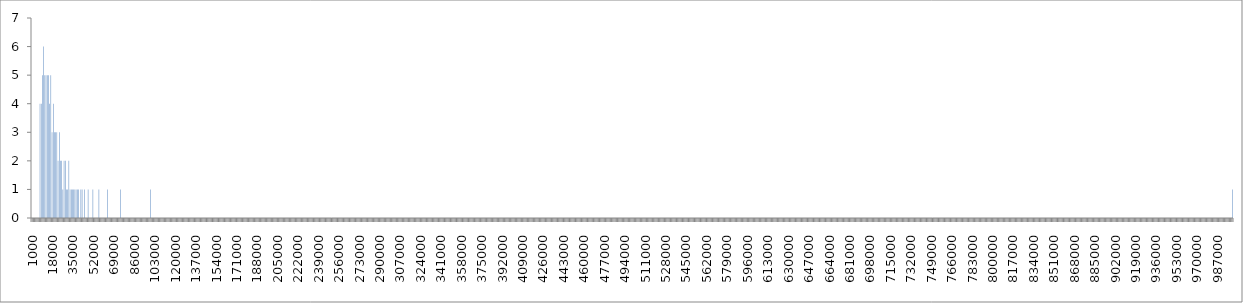
| Category | Series 0 |
|---|---|
| 1000.0 | 0 |
| 2000.0 | 0 |
| 3000.0 | 0 |
| 4000.0 | 0 |
| 5000.0 | 0 |
| 6000.0 | 0 |
| 7000.0 | 0 |
| 8000.0 | 4 |
| 9000.0 | 4 |
| 10000.0 | 5 |
| 11000.0 | 6 |
| 12000.0 | 5 |
| 13000.0 | 5 |
| 14000.0 | 5 |
| 15000.0 | 5 |
| 16000.0 | 4 |
| 17000.0 | 5 |
| 18000.0 | 3 |
| 19000.0 | 4 |
| 20000.0 | 3 |
| 21000.0 | 3 |
| 22000.0 | 3 |
| 23000.0 | 2 |
| 24000.0 | 3 |
| 25000.0 | 2 |
| 26000.0 | 2 |
| 27000.0 | 1 |
| 28000.0 | 2 |
| 29000.0 | 2 |
| 30000.0 | 1 |
| 31000.0 | 1 |
| 32000.0 | 2 |
| 33000.0 | 1 |
| 34000.0 | 1 |
| 35000.0 | 1 |
| 36000.0 | 1 |
| 37000.0 | 1 |
| 38000.0 | 1 |
| 39000.0 | 1 |
| 40000.0 | 1 |
| 41000.0 | 0 |
| 42000.0 | 1 |
| 43000.0 | 1 |
| 44000.0 | 0 |
| 45000.0 | 1 |
| 46000.0 | 0 |
| 47000.0 | 0 |
| 48000.0 | 1 |
| 49000.0 | 0 |
| 50000.0 | 0 |
| 51000.0 | 0 |
| 52000.0 | 1 |
| 53000.0 | 0 |
| 54000.0 | 0 |
| 55000.0 | 0 |
| 56000.0 | 0 |
| 57000.0 | 1 |
| 58000.0 | 0 |
| 59000.0 | 0 |
| 60000.0 | 0 |
| 61000.0 | 0 |
| 62000.0 | 0 |
| 63000.0 | 0 |
| 64000.0 | 1 |
| 65000.0 | 0 |
| 66000.0 | 0 |
| 67000.0 | 0 |
| 68000.0 | 0 |
| 69000.0 | 0 |
| 70000.0 | 0 |
| 71000.0 | 0 |
| 72000.0 | 0 |
| 73000.0 | 0 |
| 74000.0 | 0 |
| 75000.0 | 1 |
| 76000.0 | 0 |
| 77000.0 | 0 |
| 78000.0 | 0 |
| 79000.0 | 0 |
| 80000.0 | 0 |
| 81000.0 | 0 |
| 82000.0 | 0 |
| 83000.0 | 0 |
| 84000.0 | 0 |
| 85000.0 | 0 |
| 86000.0 | 0 |
| 87000.0 | 0 |
| 88000.0 | 0 |
| 89000.0 | 0 |
| 90000.0 | 0 |
| 91000.0 | 0 |
| 92000.0 | 0 |
| 93000.0 | 0 |
| 94000.0 | 0 |
| 95000.0 | 0 |
| 96000.0 | 0 |
| 97000.0 | 0 |
| 98000.0 | 0 |
| 99000.0 | 0 |
| 100000.0 | 1 |
| 101000.0 | 0 |
| 102000.0 | 0 |
| 103000.0 | 0 |
| 104000.0 | 0 |
| 105000.0 | 0 |
| 106000.0 | 0 |
| 107000.0 | 0 |
| 108000.0 | 0 |
| 109000.0 | 0 |
| 110000.0 | 0 |
| 111000.0 | 0 |
| 112000.0 | 0 |
| 113000.0 | 0 |
| 114000.0 | 0 |
| 115000.0 | 0 |
| 116000.0 | 0 |
| 117000.0 | 0 |
| 118000.0 | 0 |
| 119000.0 | 0 |
| 120000.0 | 0 |
| 121000.0 | 0 |
| 122000.0 | 0 |
| 123000.0 | 0 |
| 124000.0 | 0 |
| 125000.0 | 0 |
| 126000.0 | 0 |
| 127000.0 | 0 |
| 128000.0 | 0 |
| 129000.0 | 0 |
| 130000.0 | 0 |
| 131000.0 | 0 |
| 132000.0 | 0 |
| 133000.0 | 0 |
| 134000.0 | 0 |
| 135000.0 | 0 |
| 136000.0 | 0 |
| 137000.0 | 0 |
| 138000.0 | 0 |
| 139000.0 | 0 |
| 140000.0 | 0 |
| 141000.0 | 0 |
| 142000.0 | 0 |
| 143000.0 | 0 |
| 144000.0 | 0 |
| 145000.0 | 0 |
| 146000.0 | 0 |
| 147000.0 | 0 |
| 148000.0 | 0 |
| 149000.0 | 0 |
| 150000.0 | 0 |
| 151000.0 | 0 |
| 152000.0 | 0 |
| 153000.0 | 0 |
| 154000.0 | 0 |
| 155000.0 | 0 |
| 156000.0 | 0 |
| 157000.0 | 0 |
| 158000.0 | 0 |
| 159000.0 | 0 |
| 160000.0 | 0 |
| 161000.0 | 0 |
| 162000.0 | 0 |
| 163000.0 | 0 |
| 164000.0 | 0 |
| 165000.0 | 0 |
| 166000.0 | 0 |
| 167000.0 | 0 |
| 168000.0 | 0 |
| 169000.0 | 0 |
| 170000.0 | 0 |
| 171000.0 | 0 |
| 172000.0 | 0 |
| 173000.0 | 0 |
| 174000.0 | 0 |
| 175000.0 | 0 |
| 176000.0 | 0 |
| 177000.0 | 0 |
| 178000.0 | 0 |
| 179000.0 | 0 |
| 180000.0 | 0 |
| 181000.0 | 0 |
| 182000.0 | 0 |
| 183000.0 | 0 |
| 184000.0 | 0 |
| 185000.0 | 0 |
| 186000.0 | 0 |
| 187000.0 | 0 |
| 188000.0 | 0 |
| 189000.0 | 0 |
| 190000.0 | 0 |
| 191000.0 | 0 |
| 192000.0 | 0 |
| 193000.0 | 0 |
| 194000.0 | 0 |
| 195000.0 | 0 |
| 196000.0 | 0 |
| 197000.0 | 0 |
| 198000.0 | 0 |
| 199000.0 | 0 |
| 200000.0 | 0 |
| 201000.0 | 0 |
| 202000.0 | 0 |
| 203000.0 | 0 |
| 204000.0 | 0 |
| 205000.0 | 0 |
| 206000.0 | 0 |
| 207000.0 | 0 |
| 208000.0 | 0 |
| 209000.0 | 0 |
| 210000.0 | 0 |
| 211000.0 | 0 |
| 212000.0 | 0 |
| 213000.0 | 0 |
| 214000.0 | 0 |
| 215000.0 | 0 |
| 216000.0 | 0 |
| 217000.0 | 0 |
| 218000.0 | 0 |
| 219000.0 | 0 |
| 220000.0 | 0 |
| 221000.0 | 0 |
| 222000.0 | 0 |
| 223000.0 | 0 |
| 224000.0 | 0 |
| 225000.0 | 0 |
| 226000.0 | 0 |
| 227000.0 | 0 |
| 228000.0 | 0 |
| 229000.0 | 0 |
| 230000.0 | 0 |
| 231000.0 | 0 |
| 232000.0 | 0 |
| 233000.0 | 0 |
| 234000.0 | 0 |
| 235000.0 | 0 |
| 236000.0 | 0 |
| 237000.0 | 0 |
| 238000.0 | 0 |
| 239000.0 | 0 |
| 240000.0 | 0 |
| 241000.0 | 0 |
| 242000.0 | 0 |
| 243000.0 | 0 |
| 244000.0 | 0 |
| 245000.0 | 0 |
| 246000.0 | 0 |
| 247000.0 | 0 |
| 248000.0 | 0 |
| 249000.0 | 0 |
| 250000.0 | 0 |
| 251000.0 | 0 |
| 252000.0 | 0 |
| 253000.0 | 0 |
| 254000.0 | 0 |
| 255000.0 | 0 |
| 256000.0 | 0 |
| 257000.0 | 0 |
| 258000.0 | 0 |
| 259000.0 | 0 |
| 260000.0 | 0 |
| 261000.0 | 0 |
| 262000.0 | 0 |
| 263000.0 | 0 |
| 264000.0 | 0 |
| 265000.0 | 0 |
| 266000.0 | 0 |
| 267000.0 | 0 |
| 268000.0 | 0 |
| 269000.0 | 0 |
| 270000.0 | 0 |
| 271000.0 | 0 |
| 272000.0 | 0 |
| 273000.0 | 0 |
| 274000.0 | 0 |
| 275000.0 | 0 |
| 276000.0 | 0 |
| 277000.0 | 0 |
| 278000.0 | 0 |
| 279000.0 | 0 |
| 280000.0 | 0 |
| 281000.0 | 0 |
| 282000.0 | 0 |
| 283000.0 | 0 |
| 284000.0 | 0 |
| 285000.0 | 0 |
| 286000.0 | 0 |
| 287000.0 | 0 |
| 288000.0 | 0 |
| 289000.0 | 0 |
| 290000.0 | 0 |
| 291000.0 | 0 |
| 292000.0 | 0 |
| 293000.0 | 0 |
| 294000.0 | 0 |
| 295000.0 | 0 |
| 296000.0 | 0 |
| 297000.0 | 0 |
| 298000.0 | 0 |
| 299000.0 | 0 |
| 300000.0 | 0 |
| 301000.0 | 0 |
| 302000.0 | 0 |
| 303000.0 | 0 |
| 304000.0 | 0 |
| 305000.0 | 0 |
| 306000.0 | 0 |
| 307000.0 | 0 |
| 308000.0 | 0 |
| 309000.0 | 0 |
| 310000.0 | 0 |
| 311000.0 | 0 |
| 312000.0 | 0 |
| 313000.0 | 0 |
| 314000.0 | 0 |
| 315000.0 | 0 |
| 316000.0 | 0 |
| 317000.0 | 0 |
| 318000.0 | 0 |
| 319000.0 | 0 |
| 320000.0 | 0 |
| 321000.0 | 0 |
| 322000.0 | 0 |
| 323000.0 | 0 |
| 324000.0 | 0 |
| 325000.0 | 0 |
| 326000.0 | 0 |
| 327000.0 | 0 |
| 328000.0 | 0 |
| 329000.0 | 0 |
| 330000.0 | 0 |
| 331000.0 | 0 |
| 332000.0 | 0 |
| 333000.0 | 0 |
| 334000.0 | 0 |
| 335000.0 | 0 |
| 336000.0 | 0 |
| 337000.0 | 0 |
| 338000.0 | 0 |
| 339000.0 | 0 |
| 340000.0 | 0 |
| 341000.0 | 0 |
| 342000.0 | 0 |
| 343000.0 | 0 |
| 344000.0 | 0 |
| 345000.0 | 0 |
| 346000.0 | 0 |
| 347000.0 | 0 |
| 348000.0 | 0 |
| 349000.0 | 0 |
| 350000.0 | 0 |
| 351000.0 | 0 |
| 352000.0 | 0 |
| 353000.0 | 0 |
| 354000.0 | 0 |
| 355000.0 | 0 |
| 356000.0 | 0 |
| 357000.0 | 0 |
| 358000.0 | 0 |
| 359000.0 | 0 |
| 360000.0 | 0 |
| 361000.0 | 0 |
| 362000.0 | 0 |
| 363000.0 | 0 |
| 364000.0 | 0 |
| 365000.0 | 0 |
| 366000.0 | 0 |
| 367000.0 | 0 |
| 368000.0 | 0 |
| 369000.0 | 0 |
| 370000.0 | 0 |
| 371000.0 | 0 |
| 372000.0 | 0 |
| 373000.0 | 0 |
| 374000.0 | 0 |
| 375000.0 | 0 |
| 376000.0 | 0 |
| 377000.0 | 0 |
| 378000.0 | 0 |
| 379000.0 | 0 |
| 380000.0 | 0 |
| 381000.0 | 0 |
| 382000.0 | 0 |
| 383000.0 | 0 |
| 384000.0 | 0 |
| 385000.0 | 0 |
| 386000.0 | 0 |
| 387000.0 | 0 |
| 388000.0 | 0 |
| 389000.0 | 0 |
| 390000.0 | 0 |
| 391000.0 | 0 |
| 392000.0 | 0 |
| 393000.0 | 0 |
| 394000.0 | 0 |
| 395000.0 | 0 |
| 396000.0 | 0 |
| 397000.0 | 0 |
| 398000.0 | 0 |
| 399000.0 | 0 |
| 400000.0 | 0 |
| 401000.0 | 0 |
| 402000.0 | 0 |
| 403000.0 | 0 |
| 404000.0 | 0 |
| 405000.0 | 0 |
| 406000.0 | 0 |
| 407000.0 | 0 |
| 408000.0 | 0 |
| 409000.0 | 0 |
| 410000.0 | 0 |
| 411000.0 | 0 |
| 412000.0 | 0 |
| 413000.0 | 0 |
| 414000.0 | 0 |
| 415000.0 | 0 |
| 416000.0 | 0 |
| 417000.0 | 0 |
| 418000.0 | 0 |
| 419000.0 | 0 |
| 420000.0 | 0 |
| 421000.0 | 0 |
| 422000.0 | 0 |
| 423000.0 | 0 |
| 424000.0 | 0 |
| 425000.0 | 0 |
| 426000.0 | 0 |
| 427000.0 | 0 |
| 428000.0 | 0 |
| 429000.0 | 0 |
| 430000.0 | 0 |
| 431000.0 | 0 |
| 432000.0 | 0 |
| 433000.0 | 0 |
| 434000.0 | 0 |
| 435000.0 | 0 |
| 436000.0 | 0 |
| 437000.0 | 0 |
| 438000.0 | 0 |
| 439000.0 | 0 |
| 440000.0 | 0 |
| 441000.0 | 0 |
| 442000.0 | 0 |
| 443000.0 | 0 |
| 444000.0 | 0 |
| 445000.0 | 0 |
| 446000.0 | 0 |
| 447000.0 | 0 |
| 448000.0 | 0 |
| 449000.0 | 0 |
| 450000.0 | 0 |
| 451000.0 | 0 |
| 452000.0 | 0 |
| 453000.0 | 0 |
| 454000.0 | 0 |
| 455000.0 | 0 |
| 456000.0 | 0 |
| 457000.0 | 0 |
| 458000.0 | 0 |
| 459000.0 | 0 |
| 460000.0 | 0 |
| 461000.0 | 0 |
| 462000.0 | 0 |
| 463000.0 | 0 |
| 464000.0 | 0 |
| 465000.0 | 0 |
| 466000.0 | 0 |
| 467000.0 | 0 |
| 468000.0 | 0 |
| 469000.0 | 0 |
| 470000.0 | 0 |
| 471000.0 | 0 |
| 472000.0 | 0 |
| 473000.0 | 0 |
| 474000.0 | 0 |
| 475000.0 | 0 |
| 476000.0 | 0 |
| 477000.0 | 0 |
| 478000.0 | 0 |
| 479000.0 | 0 |
| 480000.0 | 0 |
| 481000.0 | 0 |
| 482000.0 | 0 |
| 483000.0 | 0 |
| 484000.0 | 0 |
| 485000.0 | 0 |
| 486000.0 | 0 |
| 487000.0 | 0 |
| 488000.0 | 0 |
| 489000.0 | 0 |
| 490000.0 | 0 |
| 491000.0 | 0 |
| 492000.0 | 0 |
| 493000.0 | 0 |
| 494000.0 | 0 |
| 495000.0 | 0 |
| 496000.0 | 0 |
| 497000.0 | 0 |
| 498000.0 | 0 |
| 499000.0 | 0 |
| 500000.0 | 0 |
| 501000.0 | 0 |
| 502000.0 | 0 |
| 503000.0 | 0 |
| 504000.0 | 0 |
| 505000.0 | 0 |
| 506000.0 | 0 |
| 507000.0 | 0 |
| 508000.0 | 0 |
| 509000.0 | 0 |
| 510000.0 | 0 |
| 511000.0 | 0 |
| 512000.0 | 0 |
| 513000.0 | 0 |
| 514000.0 | 0 |
| 515000.0 | 0 |
| 516000.0 | 0 |
| 517000.0 | 0 |
| 518000.0 | 0 |
| 519000.0 | 0 |
| 520000.0 | 0 |
| 521000.0 | 0 |
| 522000.0 | 0 |
| 523000.0 | 0 |
| 524000.0 | 0 |
| 525000.0 | 0 |
| 526000.0 | 0 |
| 527000.0 | 0 |
| 528000.0 | 0 |
| 529000.0 | 0 |
| 530000.0 | 0 |
| 531000.0 | 0 |
| 532000.0 | 0 |
| 533000.0 | 0 |
| 534000.0 | 0 |
| 535000.0 | 0 |
| 536000.0 | 0 |
| 537000.0 | 0 |
| 538000.0 | 0 |
| 539000.0 | 0 |
| 540000.0 | 0 |
| 541000.0 | 0 |
| 542000.0 | 0 |
| 543000.0 | 0 |
| 544000.0 | 0 |
| 545000.0 | 0 |
| 546000.0 | 0 |
| 547000.0 | 0 |
| 548000.0 | 0 |
| 549000.0 | 0 |
| 550000.0 | 0 |
| 551000.0 | 0 |
| 552000.0 | 0 |
| 553000.0 | 0 |
| 554000.0 | 0 |
| 555000.0 | 0 |
| 556000.0 | 0 |
| 557000.0 | 0 |
| 558000.0 | 0 |
| 559000.0 | 0 |
| 560000.0 | 0 |
| 561000.0 | 0 |
| 562000.0 | 0 |
| 563000.0 | 0 |
| 564000.0 | 0 |
| 565000.0 | 0 |
| 566000.0 | 0 |
| 567000.0 | 0 |
| 568000.0 | 0 |
| 569000.0 | 0 |
| 570000.0 | 0 |
| 571000.0 | 0 |
| 572000.0 | 0 |
| 573000.0 | 0 |
| 574000.0 | 0 |
| 575000.0 | 0 |
| 576000.0 | 0 |
| 577000.0 | 0 |
| 578000.0 | 0 |
| 579000.0 | 0 |
| 580000.0 | 0 |
| 581000.0 | 0 |
| 582000.0 | 0 |
| 583000.0 | 0 |
| 584000.0 | 0 |
| 585000.0 | 0 |
| 586000.0 | 0 |
| 587000.0 | 0 |
| 588000.0 | 0 |
| 589000.0 | 0 |
| 590000.0 | 0 |
| 591000.0 | 0 |
| 592000.0 | 0 |
| 593000.0 | 0 |
| 594000.0 | 0 |
| 595000.0 | 0 |
| 596000.0 | 0 |
| 597000.0 | 0 |
| 598000.0 | 0 |
| 599000.0 | 0 |
| 600000.0 | 0 |
| 601000.0 | 0 |
| 602000.0 | 0 |
| 603000.0 | 0 |
| 604000.0 | 0 |
| 605000.0 | 0 |
| 606000.0 | 0 |
| 607000.0 | 0 |
| 608000.0 | 0 |
| 609000.0 | 0 |
| 610000.0 | 0 |
| 611000.0 | 0 |
| 612000.0 | 0 |
| 613000.0 | 0 |
| 614000.0 | 0 |
| 615000.0 | 0 |
| 616000.0 | 0 |
| 617000.0 | 0 |
| 618000.0 | 0 |
| 619000.0 | 0 |
| 620000.0 | 0 |
| 621000.0 | 0 |
| 622000.0 | 0 |
| 623000.0 | 0 |
| 624000.0 | 0 |
| 625000.0 | 0 |
| 626000.0 | 0 |
| 627000.0 | 0 |
| 628000.0 | 0 |
| 629000.0 | 0 |
| 630000.0 | 0 |
| 631000.0 | 0 |
| 632000.0 | 0 |
| 633000.0 | 0 |
| 634000.0 | 0 |
| 635000.0 | 0 |
| 636000.0 | 0 |
| 637000.0 | 0 |
| 638000.0 | 0 |
| 639000.0 | 0 |
| 640000.0 | 0 |
| 641000.0 | 0 |
| 642000.0 | 0 |
| 643000.0 | 0 |
| 644000.0 | 0 |
| 645000.0 | 0 |
| 646000.0 | 0 |
| 647000.0 | 0 |
| 648000.0 | 0 |
| 649000.0 | 0 |
| 650000.0 | 0 |
| 651000.0 | 0 |
| 652000.0 | 0 |
| 653000.0 | 0 |
| 654000.0 | 0 |
| 655000.0 | 0 |
| 656000.0 | 0 |
| 657000.0 | 0 |
| 658000.0 | 0 |
| 659000.0 | 0 |
| 660000.0 | 0 |
| 661000.0 | 0 |
| 662000.0 | 0 |
| 663000.0 | 0 |
| 664000.0 | 0 |
| 665000.0 | 0 |
| 666000.0 | 0 |
| 667000.0 | 0 |
| 668000.0 | 0 |
| 669000.0 | 0 |
| 670000.0 | 0 |
| 671000.0 | 0 |
| 672000.0 | 0 |
| 673000.0 | 0 |
| 674000.0 | 0 |
| 675000.0 | 0 |
| 676000.0 | 0 |
| 677000.0 | 0 |
| 678000.0 | 0 |
| 679000.0 | 0 |
| 680000.0 | 0 |
| 681000.0 | 0 |
| 682000.0 | 0 |
| 683000.0 | 0 |
| 684000.0 | 0 |
| 685000.0 | 0 |
| 686000.0 | 0 |
| 687000.0 | 0 |
| 688000.0 | 0 |
| 689000.0 | 0 |
| 690000.0 | 0 |
| 691000.0 | 0 |
| 692000.0 | 0 |
| 693000.0 | 0 |
| 694000.0 | 0 |
| 695000.0 | 0 |
| 696000.0 | 0 |
| 697000.0 | 0 |
| 698000.0 | 0 |
| 699000.0 | 0 |
| 700000.0 | 0 |
| 701000.0 | 0 |
| 702000.0 | 0 |
| 703000.0 | 0 |
| 704000.0 | 0 |
| 705000.0 | 0 |
| 706000.0 | 0 |
| 707000.0 | 0 |
| 708000.0 | 0 |
| 709000.0 | 0 |
| 710000.0 | 0 |
| 711000.0 | 0 |
| 712000.0 | 0 |
| 713000.0 | 0 |
| 714000.0 | 0 |
| 715000.0 | 0 |
| 716000.0 | 0 |
| 717000.0 | 0 |
| 718000.0 | 0 |
| 719000.0 | 0 |
| 720000.0 | 0 |
| 721000.0 | 0 |
| 722000.0 | 0 |
| 723000.0 | 0 |
| 724000.0 | 0 |
| 725000.0 | 0 |
| 726000.0 | 0 |
| 727000.0 | 0 |
| 728000.0 | 0 |
| 729000.0 | 0 |
| 730000.0 | 0 |
| 731000.0 | 0 |
| 732000.0 | 0 |
| 733000.0 | 0 |
| 734000.0 | 0 |
| 735000.0 | 0 |
| 736000.0 | 0 |
| 737000.0 | 0 |
| 738000.0 | 0 |
| 739000.0 | 0 |
| 740000.0 | 0 |
| 741000.0 | 0 |
| 742000.0 | 0 |
| 743000.0 | 0 |
| 744000.0 | 0 |
| 745000.0 | 0 |
| 746000.0 | 0 |
| 747000.0 | 0 |
| 748000.0 | 0 |
| 749000.0 | 0 |
| 750000.0 | 0 |
| 751000.0 | 0 |
| 752000.0 | 0 |
| 753000.0 | 0 |
| 754000.0 | 0 |
| 755000.0 | 0 |
| 756000.0 | 0 |
| 757000.0 | 0 |
| 758000.0 | 0 |
| 759000.0 | 0 |
| 760000.0 | 0 |
| 761000.0 | 0 |
| 762000.0 | 0 |
| 763000.0 | 0 |
| 764000.0 | 0 |
| 765000.0 | 0 |
| 766000.0 | 0 |
| 767000.0 | 0 |
| 768000.0 | 0 |
| 769000.0 | 0 |
| 770000.0 | 0 |
| 771000.0 | 0 |
| 772000.0 | 0 |
| 773000.0 | 0 |
| 774000.0 | 0 |
| 775000.0 | 0 |
| 776000.0 | 0 |
| 777000.0 | 0 |
| 778000.0 | 0 |
| 779000.0 | 0 |
| 780000.0 | 0 |
| 781000.0 | 0 |
| 782000.0 | 0 |
| 783000.0 | 0 |
| 784000.0 | 0 |
| 785000.0 | 0 |
| 786000.0 | 0 |
| 787000.0 | 0 |
| 788000.0 | 0 |
| 789000.0 | 0 |
| 790000.0 | 0 |
| 791000.0 | 0 |
| 792000.0 | 0 |
| 793000.0 | 0 |
| 794000.0 | 0 |
| 795000.0 | 0 |
| 796000.0 | 0 |
| 797000.0 | 0 |
| 798000.0 | 0 |
| 799000.0 | 0 |
| 800000.0 | 0 |
| 801000.0 | 0 |
| 802000.0 | 0 |
| 803000.0 | 0 |
| 804000.0 | 0 |
| 805000.0 | 0 |
| 806000.0 | 0 |
| 807000.0 | 0 |
| 808000.0 | 0 |
| 809000.0 | 0 |
| 810000.0 | 0 |
| 811000.0 | 0 |
| 812000.0 | 0 |
| 813000.0 | 0 |
| 814000.0 | 0 |
| 815000.0 | 0 |
| 816000.0 | 0 |
| 817000.0 | 0 |
| 818000.0 | 0 |
| 819000.0 | 0 |
| 820000.0 | 0 |
| 821000.0 | 0 |
| 822000.0 | 0 |
| 823000.0 | 0 |
| 824000.0 | 0 |
| 825000.0 | 0 |
| 826000.0 | 0 |
| 827000.0 | 0 |
| 828000.0 | 0 |
| 829000.0 | 0 |
| 830000.0 | 0 |
| 831000.0 | 0 |
| 832000.0 | 0 |
| 833000.0 | 0 |
| 834000.0 | 0 |
| 835000.0 | 0 |
| 836000.0 | 0 |
| 837000.0 | 0 |
| 838000.0 | 0 |
| 839000.0 | 0 |
| 840000.0 | 0 |
| 841000.0 | 0 |
| 842000.0 | 0 |
| 843000.0 | 0 |
| 844000.0 | 0 |
| 845000.0 | 0 |
| 846000.0 | 0 |
| 847000.0 | 0 |
| 848000.0 | 0 |
| 849000.0 | 0 |
| 850000.0 | 0 |
| 851000.0 | 0 |
| 852000.0 | 0 |
| 853000.0 | 0 |
| 854000.0 | 0 |
| 855000.0 | 0 |
| 856000.0 | 0 |
| 857000.0 | 0 |
| 858000.0 | 0 |
| 859000.0 | 0 |
| 860000.0 | 0 |
| 861000.0 | 0 |
| 862000.0 | 0 |
| 863000.0 | 0 |
| 864000.0 | 0 |
| 865000.0 | 0 |
| 866000.0 | 0 |
| 867000.0 | 0 |
| 868000.0 | 0 |
| 869000.0 | 0 |
| 870000.0 | 0 |
| 871000.0 | 0 |
| 872000.0 | 0 |
| 873000.0 | 0 |
| 874000.0 | 0 |
| 875000.0 | 0 |
| 876000.0 | 0 |
| 877000.0 | 0 |
| 878000.0 | 0 |
| 879000.0 | 0 |
| 880000.0 | 0 |
| 881000.0 | 0 |
| 882000.0 | 0 |
| 883000.0 | 0 |
| 884000.0 | 0 |
| 885000.0 | 0 |
| 886000.0 | 0 |
| 887000.0 | 0 |
| 888000.0 | 0 |
| 889000.0 | 0 |
| 890000.0 | 0 |
| 891000.0 | 0 |
| 892000.0 | 0 |
| 893000.0 | 0 |
| 894000.0 | 0 |
| 895000.0 | 0 |
| 896000.0 | 0 |
| 897000.0 | 0 |
| 898000.0 | 0 |
| 899000.0 | 0 |
| 900000.0 | 0 |
| 901000.0 | 0 |
| 902000.0 | 0 |
| 903000.0 | 0 |
| 904000.0 | 0 |
| 905000.0 | 0 |
| 906000.0 | 0 |
| 907000.0 | 0 |
| 908000.0 | 0 |
| 909000.0 | 0 |
| 910000.0 | 0 |
| 911000.0 | 0 |
| 912000.0 | 0 |
| 913000.0 | 0 |
| 914000.0 | 0 |
| 915000.0 | 0 |
| 916000.0 | 0 |
| 917000.0 | 0 |
| 918000.0 | 0 |
| 919000.0 | 0 |
| 920000.0 | 0 |
| 921000.0 | 0 |
| 922000.0 | 0 |
| 923000.0 | 0 |
| 924000.0 | 0 |
| 925000.0 | 0 |
| 926000.0 | 0 |
| 927000.0 | 0 |
| 928000.0 | 0 |
| 929000.0 | 0 |
| 930000.0 | 0 |
| 931000.0 | 0 |
| 932000.0 | 0 |
| 933000.0 | 0 |
| 934000.0 | 0 |
| 935000.0 | 0 |
| 936000.0 | 0 |
| 937000.0 | 0 |
| 938000.0 | 0 |
| 939000.0 | 0 |
| 940000.0 | 0 |
| 941000.0 | 0 |
| 942000.0 | 0 |
| 943000.0 | 0 |
| 944000.0 | 0 |
| 945000.0 | 0 |
| 946000.0 | 0 |
| 947000.0 | 0 |
| 948000.0 | 0 |
| 949000.0 | 0 |
| 950000.0 | 0 |
| 951000.0 | 0 |
| 952000.0 | 0 |
| 953000.0 | 0 |
| 954000.0 | 0 |
| 955000.0 | 0 |
| 956000.0 | 0 |
| 957000.0 | 0 |
| 958000.0 | 0 |
| 959000.0 | 0 |
| 960000.0 | 0 |
| 961000.0 | 0 |
| 962000.0 | 0 |
| 963000.0 | 0 |
| 964000.0 | 0 |
| 965000.0 | 0 |
| 966000.0 | 0 |
| 967000.0 | 0 |
| 968000.0 | 0 |
| 969000.0 | 0 |
| 970000.0 | 0 |
| 971000.0 | 0 |
| 972000.0 | 0 |
| 973000.0 | 0 |
| 974000.0 | 0 |
| 975000.0 | 0 |
| 976000.0 | 0 |
| 977000.0 | 0 |
| 978000.0 | 0 |
| 979000.0 | 0 |
| 980000.0 | 0 |
| 981000.0 | 0 |
| 982000.0 | 0 |
| 983000.0 | 0 |
| 984000.0 | 0 |
| 985000.0 | 0 |
| 986000.0 | 0 |
| 987000.0 | 0 |
| 988000.0 | 0 |
| 989000.0 | 0 |
| 990000.0 | 0 |
| 991000.0 | 0 |
| 992000.0 | 0 |
| 993000.0 | 0 |
| 994000.0 | 0 |
| 995000.0 | 0 |
| 996000.0 | 0 |
| 997000.0 | 0 |
| 998000.0 | 0 |
| 999000.0 | 0 |
| 1000000.0 | 1 |